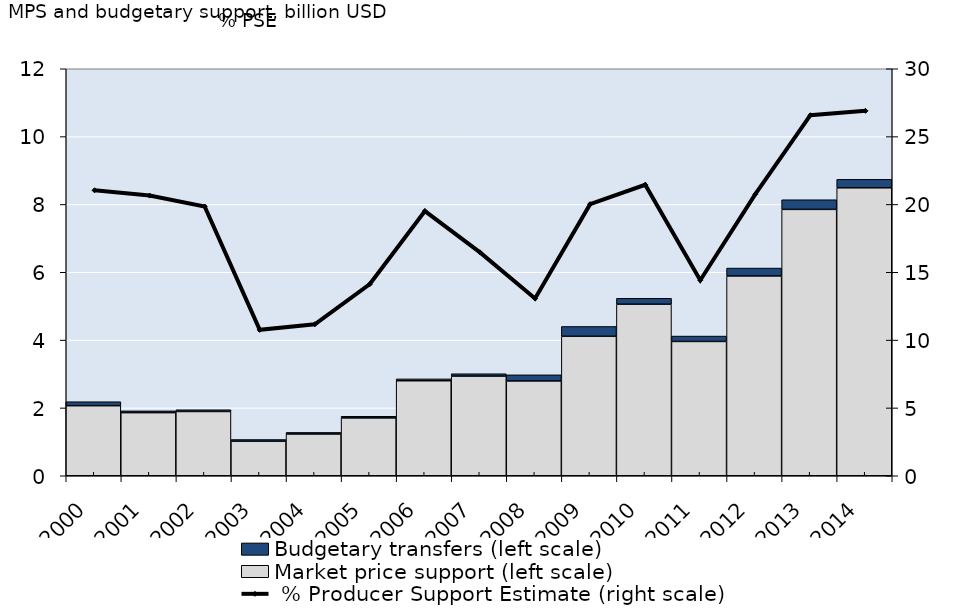
| Category | Market price support (left scale) | Budgetary transfers (left scale) |
|---|---|---|
| 2000.0 | 2.066 | 0.117 |
| 2001.0 | 1.861 | 0.052 |
| 2002.0 | 1.895 | 0.051 |
| 2003.0 | 1.017 | 0.052 |
| 2004.0 | 1.232 | 0.046 |
| 2005.0 | 1.706 | 0.048 |
| 2006.0 | 2.801 | 0.054 |
| 2007.0 | 2.939 | 0.069 |
| 2008.0 | 2.796 | 0.18 |
| 2009.0 | 4.112 | 0.289 |
| 2010.0 | 5.058 | 0.174 |
| 2011.0 | 3.96 | 0.159 |
| 2012.0 | 5.892 | 0.232 |
| 2013.0 | 7.854 | 0.284 |
| 2014.0 | 8.491 | 0.249 |